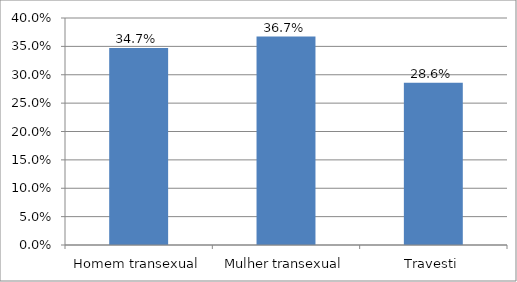
| Category | Series 0 |
|---|---|
| Homem transexual | 0.347 |
| Mulher transexual | 0.367 |
| Travesti | 0.286 |